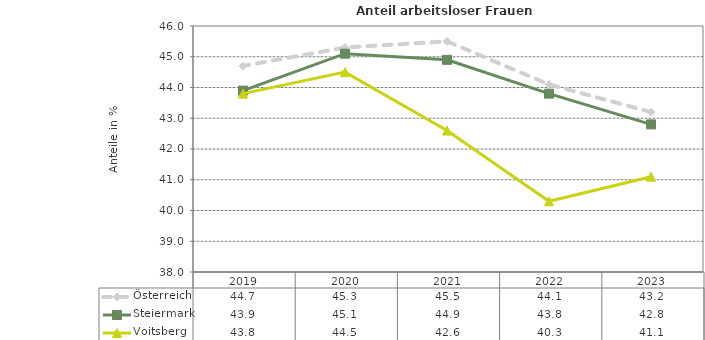
| Category | Österreich | Steiermark | Voitsberg |
|---|---|---|---|
| 2023.0 | 43.2 | 42.8 | 41.1 |
| 2022.0 | 44.1 | 43.8 | 40.3 |
| 2021.0 | 45.5 | 44.9 | 42.6 |
| 2020.0 | 45.3 | 45.1 | 44.5 |
| 2019.0 | 44.7 | 43.9 | 43.8 |